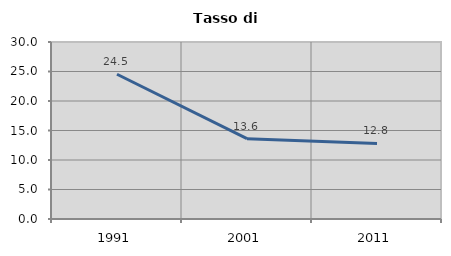
| Category | Tasso di disoccupazione   |
|---|---|
| 1991.0 | 24.53 |
| 2001.0 | 13.621 |
| 2011.0 | 12.797 |